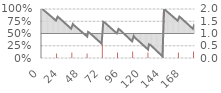
| Category | AIRFRAME |
|---|---|
| 0 | 0 |
| 1 | 0 |
| 2 | 0 |
| 3 | 0 |
| 4 | 0 |
| 5 | 0 |
| 6 | 0 |
| 7 | 0 |
| 8 | 0 |
| 9 | 0 |
| 10 | 0 |
| 11 | 0 |
| 12 | 0 |
| 13 | 0 |
| 14 | 0 |
| 15 | 0 |
| 16 | 0 |
| 17 | 0 |
| 18 | 185400 |
| 19 | 0 |
| 20 | 0 |
| 21 | 0 |
| 22 | 0 |
| 23 | 0 |
| 24 | 0 |
| 25 | 0 |
| 26 | 0 |
| 27 | 0 |
| 28 | 0 |
| 29 | 0 |
| 30 | 0 |
| 31 | 0 |
| 32 | 0 |
| 33 | 0 |
| 34 | 0 |
| 35 | 0 |
| 36 | 220400 |
| 37 | 0 |
| 38 | 0 |
| 39 | 0 |
| 40 | 0 |
| 41 | 0 |
| 42 | 0 |
| 43 | 0 |
| 44 | 0 |
| 45 | 0 |
| 46 | 0 |
| 47 | 0 |
| 48 | 0 |
| 49 | 0 |
| 50 | 0 |
| 51 | 0 |
| 52 | 0 |
| 53 | 0 |
| 54 | 185400 |
| 55 | 0 |
| 56 | 0 |
| 57 | 0 |
| 58 | 0 |
| 59 | 0 |
| 60 | 0 |
| 61 | 0 |
| 62 | 0 |
| 63 | 0 |
| 64 | 0 |
| 65 | 0 |
| 66 | 0 |
| 67 | 0 |
| 68 | 0 |
| 69 | 0 |
| 70 | 0 |
| 71 | 0 |
| 72 | 827090 |
| 73 | 0 |
| 74 | 0 |
| 75 | 0 |
| 76 | 0 |
| 77 | 0 |
| 78 | 0 |
| 79 | 0 |
| 80 | 0 |
| 81 | 0 |
| 82 | 0 |
| 83 | 0 |
| 84 | 0 |
| 85 | 0 |
| 86 | 0 |
| 87 | 0 |
| 88 | 0 |
| 89 | 0 |
| 90 | 222480 |
| 91 | 0 |
| 92 | 0 |
| 93 | 0 |
| 94 | 0 |
| 95 | 0 |
| 96 | 0 |
| 97 | 0 |
| 98 | 0 |
| 99 | 0 |
| 100 | 0 |
| 101 | 0 |
| 102 | 0 |
| 103 | 0 |
| 104 | 0 |
| 105 | 0 |
| 106 | 0 |
| 107 | 0 |
| 108 | 264480 |
| 109 | 0 |
| 110 | 0 |
| 111 | 0 |
| 112 | 0 |
| 113 | 0 |
| 114 | 0 |
| 115 | 0 |
| 116 | 0 |
| 117 | 0 |
| 118 | 0 |
| 119 | 0 |
| 120 | 0 |
| 121 | 0 |
| 122 | 0 |
| 123 | 0 |
| 124 | 0 |
| 125 | 0 |
| 126 | 222480 |
| 127 | 0 |
| 128 | 0 |
| 129 | 0 |
| 130 | 0 |
| 131 | 0 |
| 132 | 0 |
| 133 | 0 |
| 134 | 0 |
| 135 | 0 |
| 136 | 0 |
| 137 | 0 |
| 138 | 0 |
| 139 | 0 |
| 140 | 0 |
| 141 | 0 |
| 142 | 0 |
| 143 | 0 |
| 144 | 1853433.5 |
| 145 | 0 |
| 146 | 0 |
| 147 | 0 |
| 148 | 0 |
| 149 | 0 |
| 150 | 0 |
| 151 | 0 |
| 152 | 0 |
| 153 | 0 |
| 154 | 0 |
| 155 | 0 |
| 156 | 0 |
| 157 | 0 |
| 158 | 0 |
| 159 | 0 |
| 160 | 0 |
| 161 | 0 |
| 162 | 222480 |
| 163 | 0 |
| 164 | 0 |
| 165 | 0 |
| 166 | 0 |
| 167 | 0 |
| 168 | 0 |
| 169 | 0 |
| 170 | 0 |
| 171 | 0 |
| 172 | 0 |
| 173 | 0 |
| 174 | 0 |
| 175 | 0 |
| 176 | 0 |
| 177 | 0 |
| 178 | 0 |
| 179 | 0 |
| 180 | 264480 |